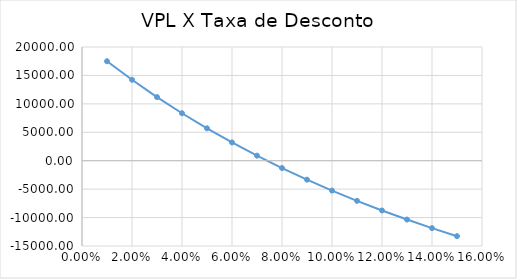
| Category | VPL |
|---|---|
| 0.01 | 17496.999 |
| 0.02 | 14233.9 |
| 0.03 | 11191.059 |
| 0.04 | 8350.658 |
| 0.05 | 5696.52 |
| 0.06 | 3213.94 |
| 0.07 | 889.537 |
| 0.08 | -1288.876 |
| 0.09 | -3332.417 |
| 0.1 | -5251.231 |
| 0.11 | -7054.591 |
| 0.12 | -8750.979 |
| 0.13 | -10348.16 |
| 0.14 | -11853.252 |
| 0.15 | -13272.784 |